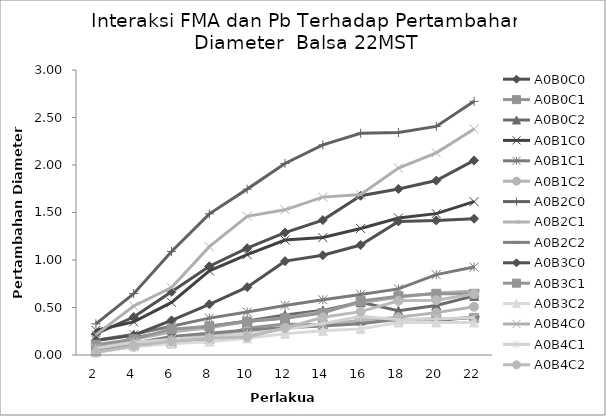
| Category | A0B0C0 | A0B0C1 | A0B0C2 | A0B1C0 | A0B1C1 | A0B1C2 | A0B2C0 | A0B2C1 | A0B2C2 | A0B3C0 | A0B3C1 | A0B3C2 | A0B4C0 | A0B4C1 | A0B4C2 |
|---|---|---|---|---|---|---|---|---|---|---|---|---|---|---|---|
| 2.0 | 0.222 | 0.044 | 0.044 | 0.26 | 0.156 | 0.032 | 0.328 | 0.076 | 0.058 | 0.152 | 0.108 | 0.025 | 0.214 | 0.068 | 0.03 |
| 4.0 | 0.4 | 0.096 | 0.182 | 0.348 | 0.218 | 0.086 | 0.646 | 0.166 | 0.124 | 0.208 | 0.166 | 0.09 | 0.516 | 0.134 | 0.097 |
| 6.0 | 0.666 | 0.128 | 0.25 | 0.554 | 0.302 | 0.15 | 1.09 | 0.242 | 0.196 | 0.364 | 0.272 | 0.118 | 0.71 | 0.164 | 0.143 |
| 8.0 | 0.934 | 0.17 | 0.304 | 0.886 | 0.388 | 0.218 | 1.486 | 0.286 | 0.23 | 0.534 | 0.302 | 0.14 | 1.14 | 0.19 | 0.177 |
| 10.0 | 1.124 | 0.282 | 0.358 | 1.056 | 0.452 | 0.254 | 1.746 | 0.352 | 0.262 | 0.714 | 0.352 | 0.175 | 1.46 | 0.224 | 0.19 |
| 12.0 | 1.288 | 0.326 | 0.422 | 1.21 | 0.522 | 0.288 | 2.016 | 0.39 | 0.286 | 0.988 | 0.388 | 0.223 | 1.528 | 0.272 | 0.283 |
| 14.0 | 1.42 | 0.316 | 0.47 | 1.236 | 0.582 | 0.314 | 2.212 | 0.456 | 0.306 | 1.05 | 0.442 | 0.255 | 1.662 | 0.33 | 0.397 |
| 16.0 | 1.676 | 0.362 | 0.556 | 1.332 | 0.638 | 0.364 | 2.334 | 0.55 | 0.33 | 1.158 | 0.568 | 0.275 | 1.69 | 0.408 | 0.457 |
| 18.0 | 1.748 | 0.372 | 0.466 | 1.442 | 0.696 | 0.398 | 2.342 | 0.608 | 0.376 | 1.406 | 0.618 | 0.342 | 1.968 | 0.372 | 0.57 |
| 20.0 | 1.836 | 0.38 | 0.522 | 1.488 | 0.846 | 0.446 | 2.406 | 0.652 | 0.358 | 1.416 | 0.644 | 0.342 | 2.128 | 0.378 | 0.577 |
| 22.0 | 2.048 | 0.39 | 0.622 | 1.614 | 0.926 | 0.508 | 2.67 | 0.674 | 0.402 | 1.434 | 0.644 | 0.342 | 2.38 | 0.396 | 0.643 |